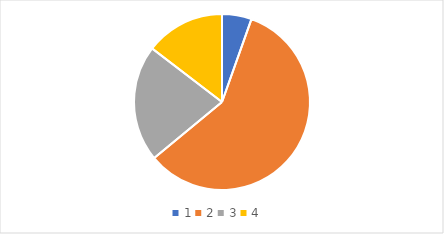
| Category | Series 0 |
|---|---|
| 0 | 32 |
| 1 | 345 |
| 2 | 126 |
| 3 | 86 |